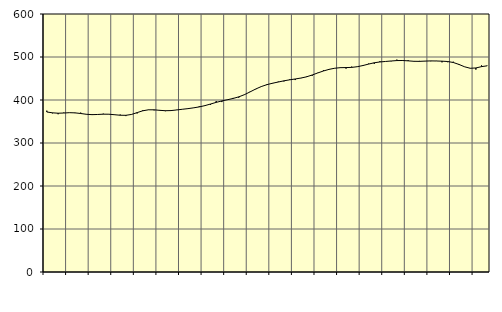
| Category | Piggar | Series 1 |
|---|---|---|
| nan | 375.2 | 372.1 |
| 1.0 | 369 | 370.19 |
| 1.0 | 366.9 | 369.26 |
| 1.0 | 370.7 | 369.73 |
| nan | 370.7 | 370.53 |
| 2.0 | 369.6 | 370.08 |
| 2.0 | 370.7 | 368.57 |
| 2.0 | 366.3 | 366.8 |
| nan | 365.2 | 365.92 |
| 3.0 | 366 | 366.35 |
| 3.0 | 368.2 | 367.04 |
| 3.0 | 367 | 366.92 |
| nan | 365.2 | 365.75 |
| 4.0 | 366.1 | 364.55 |
| 4.0 | 362.6 | 364.4 |
| 4.0 | 366.7 | 366.4 |
| nan | 368.7 | 370.68 |
| 5.0 | 376.3 | 374.91 |
| 5.0 | 376.8 | 377.21 |
| 5.0 | 376 | 377.16 |
| nan | 376.8 | 375.98 |
| 6.0 | 374 | 375.1 |
| 6.0 | 375.2 | 375.39 |
| 6.0 | 377.2 | 376.83 |
| nan | 378.3 | 378.43 |
| 7.0 | 380 | 379.92 |
| 7.0 | 381.5 | 381.76 |
| 7.0 | 385.5 | 383.94 |
| nan | 387.5 | 386.9 |
| 8.0 | 388.7 | 390.66 |
| 8.0 | 397.6 | 394.47 |
| 8.0 | 395.2 | 397.84 |
| nan | 401.1 | 400.61 |
| 9.0 | 404.8 | 403.63 |
| 9.0 | 405.4 | 407.33 |
| 9.0 | 413 | 412.36 |
| nan | 419.4 | 418.83 |
| 10.0 | 425 | 425.55 |
| 10.0 | 432 | 431.32 |
| 10.0 | 436.7 | 435.79 |
| nan | 438.4 | 439.07 |
| 11.0 | 442.8 | 441.8 |
| 11.0 | 443.2 | 444.6 |
| 11.0 | 448 | 446.9 |
| nan | 446.4 | 448.88 |
| 12.0 | 450.7 | 451.03 |
| 12.0 | 454.6 | 453.88 |
| 12.0 | 456.2 | 458.16 |
| nan | 463.4 | 462.97 |
| 13.0 | 469.2 | 467.5 |
| 13.0 | 470.5 | 471.28 |
| 13.0 | 474.1 | 473.87 |
| nan | 476 | 475.19 |
| 14.0 | 472.9 | 475.43 |
| 14.0 | 477.7 | 475.8 |
| 14.0 | 477 | 477.45 |
| nan | 479.3 | 480.17 |
| 15.0 | 484.7 | 483.53 |
| 15.0 | 484.1 | 486.6 |
| 15.0 | 490.2 | 488.45 |
| nan | 489.5 | 489.63 |
| 16.0 | 490.1 | 490.72 |
| 16.0 | 494 | 491.68 |
| 16.0 | 492.9 | 491.85 |
| nan | 492.7 | 491.04 |
| 17.0 | 489.4 | 490.03 |
| 17.0 | 490.9 | 489.85 |
| 17.0 | 490.6 | 490.46 |
| nan | 490.2 | 490.95 |
| 18.0 | 491 | 490.71 |
| 18.0 | 487.6 | 490.29 |
| 18.0 | 487.9 | 489.52 |
| nan | 489 | 487.19 |
| 19.0 | 481.6 | 482.73 |
| 19.0 | 477 | 477.24 |
| 19.0 | 473.4 | 473.8 |
| nan | 470.7 | 474.5 |
| 20.0 | 480.5 | 477.6 |
| 20.0 | 480.1 | 479.5 |